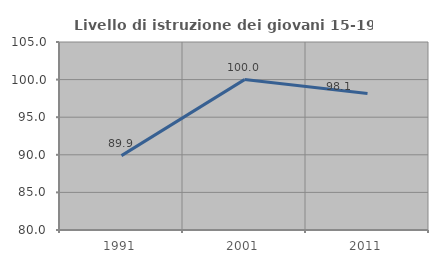
| Category | Livello di istruzione dei giovani 15-19 anni |
|---|---|
| 1991.0 | 89.888 |
| 2001.0 | 100 |
| 2011.0 | 98.148 |